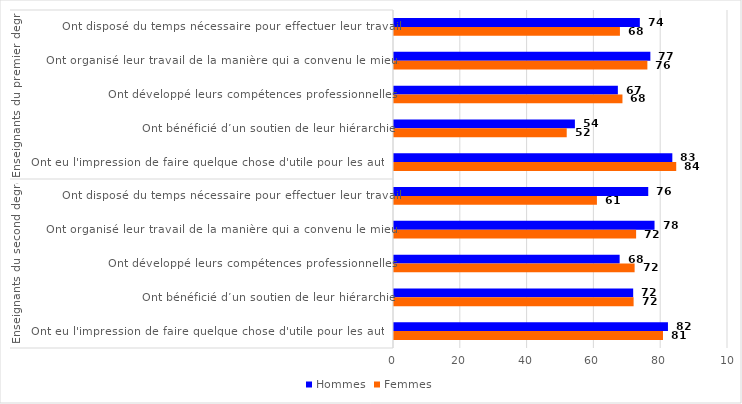
| Category | Hommes | Femmes |
|---|---|---|
| 0 | 73.603 | 67.644 |
| 1 | 76.755 | 75.861 |
| 2 | 67.026 | 68.399 |
| 3 | 54.161 | 51.714 |
| 4 | 83.333 | 84.498 |
| 5 | 76.121 | 60.755 |
| 6 | 78.004 | 72.49 |
| 7 | 67.556 | 72.038 |
| 8 | 71.612 | 71.74 |
| 9 | 82.021 | 80.534 |